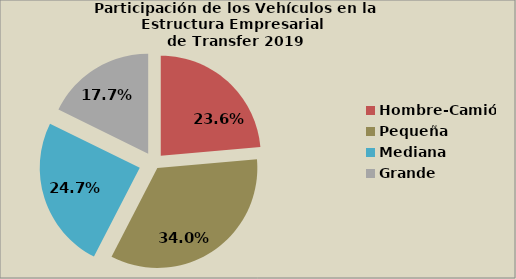
| Category | Series 0 |
|---|---|
| Hombre-Camión | 23.616 |
| Pequeña | 33.957 |
| Mediana | 24.69 |
| Grande | 17.736 |